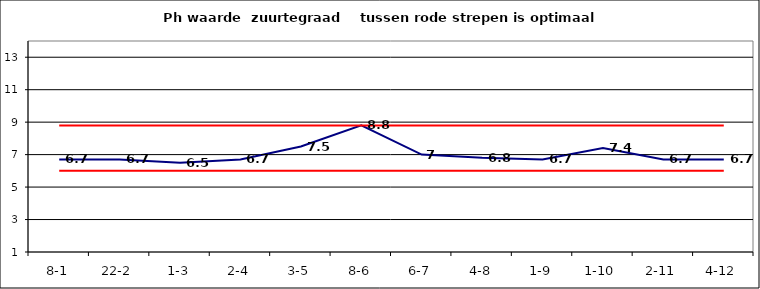
| Category | Series 0 | Series 1 | Series 2 |
|---|---|---|---|
| 8-1 | 6.7 | 6 | 8.8 |
| 22-2 | 6.7 | 6 | 8.8 |
| 1-3 | 6.5 | 6 | 8.8 |
| 2-4 | 6.7 | 6 | 8.8 |
| 3-5 | 7.5 | 6 | 8.8 |
| 8-6 | 8.8 | 6 | 8.8 |
| 6-7 | 7 | 6 | 8.8 |
| 4-8 | 6.8 | 6 | 8.8 |
| 1-9 | 6.7 | 6 | 8.8 |
| 1-10 | 7.4 | 6 | 8.8 |
| 2-11 | 6.7 | 6 | 8.8 |
| 4-12 | 6.7 | 6 | 8.8 |